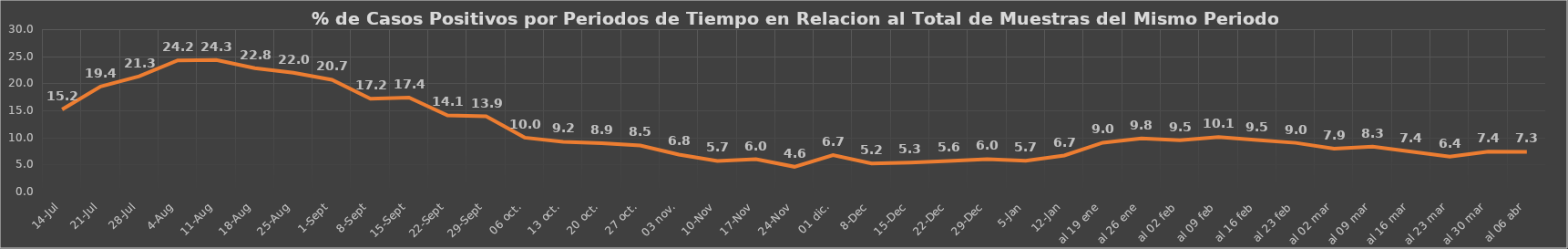
| Category | Series 1 |
|---|---|
| 14-Jul | 15.176 |
| 21-Jul | 19.42 |
| 28-Jul | 21.285 |
| 4-Ago | 24.235 |
| 11-Ago | 24.319 |
| 18-Ago | 22.795 |
| 25-Ago | 21.959 |
| 1-Set | 20.651 |
| 8-Set | 17.154 |
| 15-Set | 17.374 |
| 22-Set | 14.076 |
| 29-Set | 13.895 |
| 06 oct. | 9.966 |
| 13 oct. | 9.195 |
| 20 oct. | 8.915 |
| 27 oct. | 8.521 |
| 03 nov. | 6.828 |
| 10-Nov | 5.654 |
| 17-Nov | 5.983 |
| 24-Nov | 4.579 |
|  01 dic. | 6.72 |
| 8-Dic | 5.183 |
| 15-Dic | 5.348 |
| 22-Dic | 5.649 |
| 29-Dic | 6.002 |
| 5-Ene | 5.693 |
| 12-Ene | 6.656 |
| al 19 ene | 9.025 |
| al 26 ene | 9.811 |
| al 02 feb | 9.494 |
| al 09 feb | 10.077 |
| al 16 feb | 9.503 |
| al 23 feb | 8.995 |
| al 02 mar | 7.918 |
| al 09 mar | 8.305 |
| al 16 mar | 7.379 |
| al 23 mar | 6.443 |
| al 30 mar | 7.383 |
| al 06 abr | 7.345 |